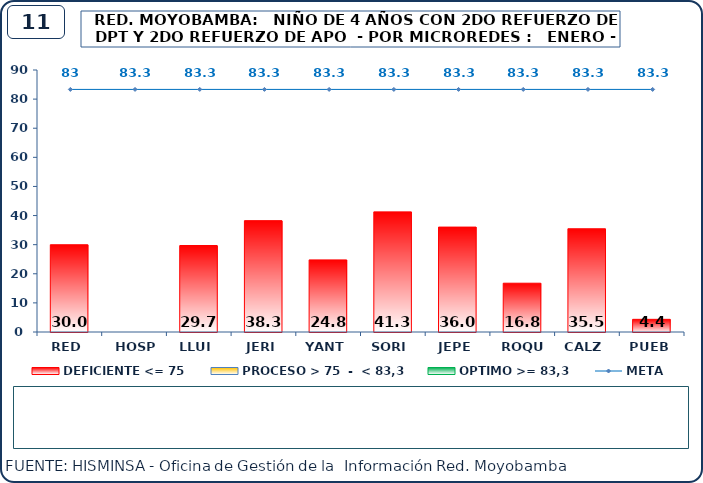
| Category | DEFICIENTE <= 75 | PROCESO > 75  -  < 83,3 | OPTIMO >= 83,3 |
|---|---|---|---|
| RED | 29.99 | 0 | 0 |
| HOSP | 0 | 0 | 0 |
| LLUI | 29.71 | 0 | 0 |
| JERI | 38.26 | 0 | 0 |
| YANT | 24.77 | 0 | 0 |
| SORI | 41.27 | 0 | 0 |
| JEPE | 36.04 | 0 | 0 |
| ROQU | 16.76 | 0 | 0 |
| CALZ | 35.48 | 0 | 0 |
| PUEB | 4.35 | 0 | 0 |